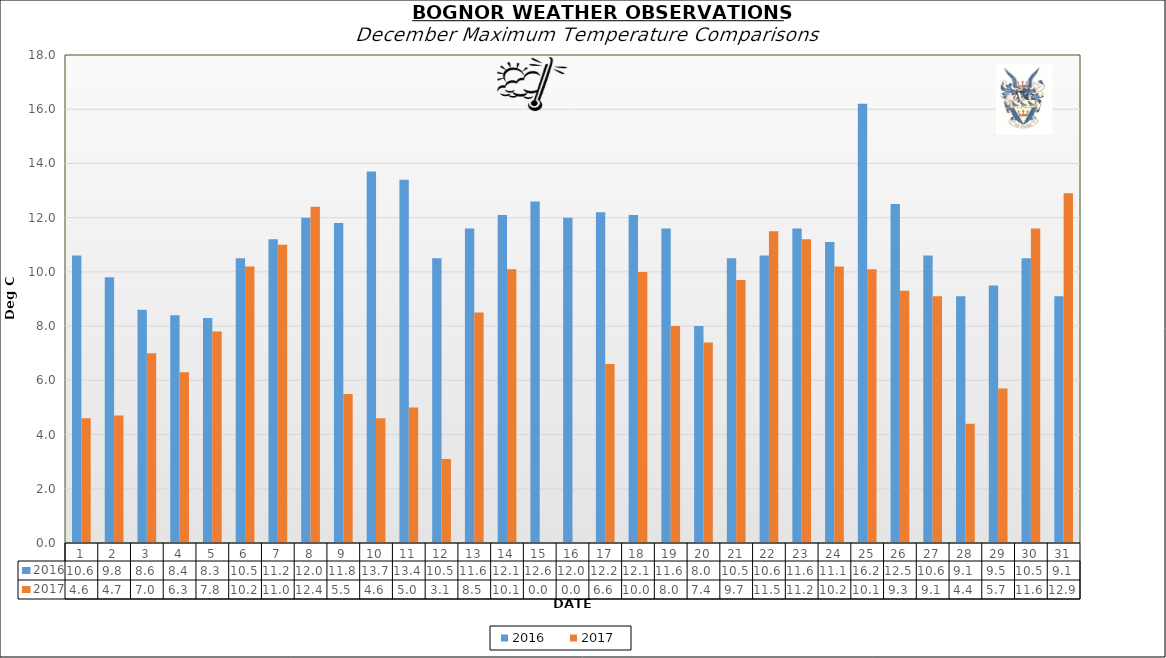
| Category | 2016 | 2017 |
|---|---|---|
| 0 | 10.6 | 4.6 |
| 1 | 9.8 | 4.7 |
| 2 | 8.6 | 7 |
| 3 | 8.4 | 6.3 |
| 4 | 8.3 | 7.8 |
| 5 | 10.5 | 10.2 |
| 6 | 11.2 | 11 |
| 7 | 12 | 12.4 |
| 8 | 11.8 | 5.5 |
| 9 | 13.7 | 4.6 |
| 10 | 13.4 | 5 |
| 11 | 10.5 | 3.1 |
| 12 | 11.6 | 8.5 |
| 13 | 12.1 | 10.1 |
| 14 | 12.6 | 0 |
| 15 | 12 | 0 |
| 16 | 12.2 | 6.6 |
| 17 | 12.1 | 10 |
| 18 | 11.6 | 8 |
| 19 | 8 | 7.4 |
| 20 | 10.5 | 9.7 |
| 21 | 10.6 | 11.5 |
| 22 | 11.6 | 11.2 |
| 23 | 11.1 | 10.2 |
| 24 | 16.2 | 10.1 |
| 25 | 12.5 | 9.3 |
| 26 | 10.6 | 9.1 |
| 27 | 9.1 | 4.4 |
| 28 | 9.5 | 5.7 |
| 29 | 10.5 | 11.6 |
| 30 | 9.1 | 12.9 |